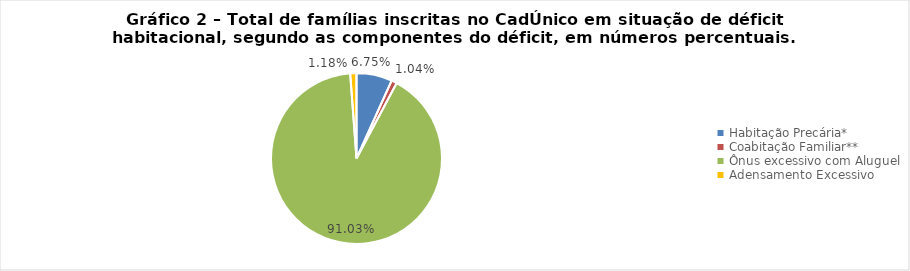
| Category | Series 0 |
|---|---|
| Habitação Precária* | 0.067 |
| Coabitação Familiar** | 0.01 |
| Ônus excessivo com Aluguel | 0.91 |
| Adensamento Excessivo | 0.012 |